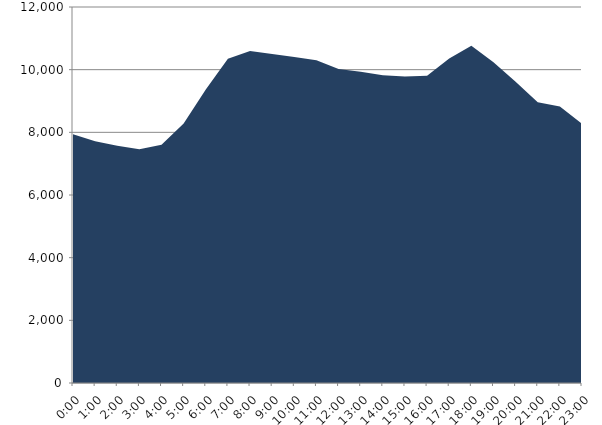
| Category | Series 0 | Series 1 |
|---|---|---|
| 2017-02-15 |  | 7940.1 |
| 2017-02-15 01:00:00 |  | 7714.36 |
| 2017-02-15 02:00:00 |  | 7571.79 |
| 2017-02-15 03:00:00 |  | 7457.22 |
| 2017-02-15 04:00:00 |  | 7603.49 |
| 2017-02-15 05:00:00 |  | 8278.47 |
| 2017-02-15 06:00:00 |  | 9365.28 |
| 2017-02-15 07:00:00 |  | 10346.73 |
| 2017-02-15 08:00:00 |  | 10592.71 |
| 2017-02-15 09:00:00 |  | 10502.63 |
| 2017-02-15 10:00:00 |  | 10402.62 |
| 2017-02-15 11:00:00 |  | 10303.14 |
| 2017-02-15 12:00:00 |  | 10023.11 |
| 2017-02-15 13:00:00 |  | 9930.69 |
| 2017-02-15 14:00:00 |  | 9822.42 |
| 2017-02-15 15:00:00 |  | 9779.29 |
| 2017-02-15 16:00:00 |  | 9808.31 |
| 2017-02-15 17:00:00 |  | 10354.48 |
| 2017-02-15 18:00:00 |  | 10764.48 |
| 2017-02-15 19:00:00 |  | 10235.02 |
| 2017-02-15 20:00:00 |  | 9612.12 |
| 2017-02-15 21:00:00 |  | 8962.11 |
| 2017-02-15 22:00:00 |  | 8826.78 |
| 2017-02-15 23:00:00 |  | 8269.53 |